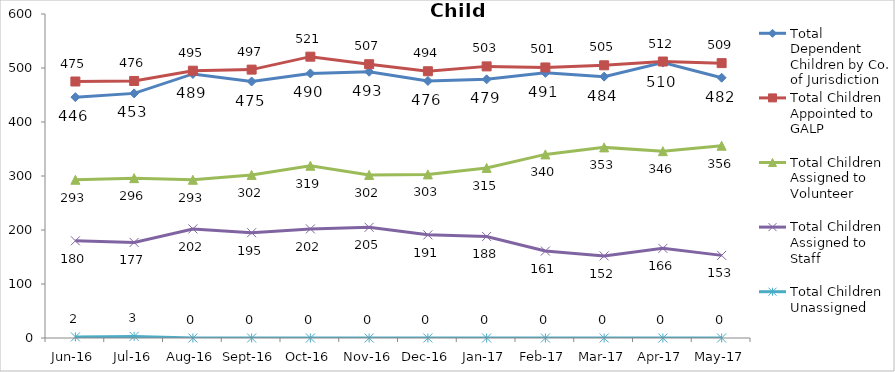
| Category | Total Dependent Children by Co. of Jurisdiction | Total Children Appointed to GALP | Total Children Assigned to Volunteer | Total Children Assigned to Staff | Total Children Unassigned |
|---|---|---|---|---|---|
| Jun-16 | 446 | 475 | 293 | 180 | 2 |
| Jul-16 | 453 | 476 | 296 | 177 | 3 |
| Aug-16 | 489 | 495 | 293 | 202 | 0 |
| Sep-16 | 475 | 497 | 302 | 195 | 0 |
| Oct-16 | 490 | 521 | 319 | 202 | 0 |
| Nov-16 | 493 | 507 | 302 | 205 | 0 |
| Dec-16 | 476 | 494 | 303 | 191 | 0 |
| Jan-17 | 479 | 503 | 315 | 188 | 0 |
| Feb-17 | 491 | 501 | 340 | 161 | 0 |
| Mar-17 | 484 | 505 | 353 | 152 | 0 |
| Apr-17 | 510 | 512 | 346 | 166 | 0 |
| May-17 | 482 | 509 | 356 | 153 | 0 |